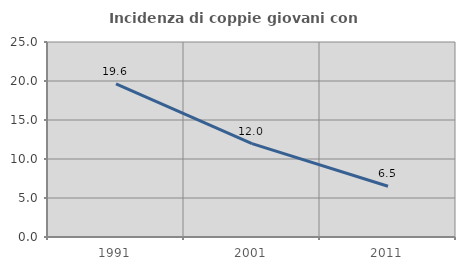
| Category | Incidenza di coppie giovani con figli |
|---|---|
| 1991.0 | 19.638 |
| 2001.0 | 11.978 |
| 2011.0 | 6.502 |